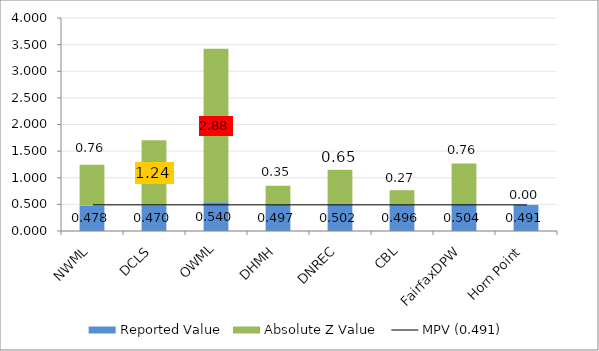
| Category | Reported Value | Absolute Z Value  |
|---|---|---|
| NWML | 0.478 | 0.765 |
| DCLS | 0.47 | 1.235 |
| OWML | 0.54 | 2.882 |
| DHMH | 0.497 | 0.353 |
| DNREC | 0.502 | 0.647 |
| CBL | 0.496 | 0.271 |
| FairfaxDPW | 0.504 | 0.765 |
| Horn Point | 0.491 | 0 |